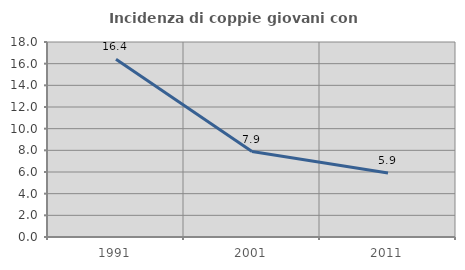
| Category | Incidenza di coppie giovani con figli |
|---|---|
| 1991.0 | 16.413 |
| 2001.0 | 7.884 |
| 2011.0 | 5.904 |